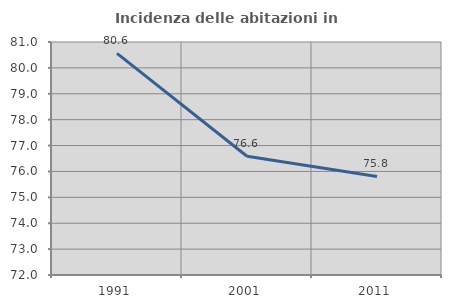
| Category | Incidenza delle abitazioni in proprietà  |
|---|---|
| 1991.0 | 80.56 |
| 2001.0 | 76.587 |
| 2011.0 | 75.805 |